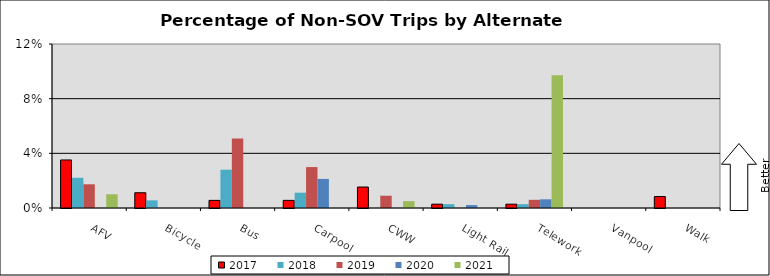
| Category | 2017 | 2018 | 2019 | 2020 | 2021 |
|---|---|---|---|---|---|
| AFV | 0.035 | 0.022 | 0.017 | 0 | 0.01 |
| Bicycle | 0.011 | 0.006 | 0 | 0 | 0 |
| Bus | 0.006 | 0.028 | 0.051 | 0 | 0 |
| Carpool | 0.006 | 0.011 | 0.03 | 0.021 | 0 |
| CWW | 0.015 | 0 | 0.009 | 0 | 0.005 |
| Light Rail | 0.003 | 0.003 | 0 | 0.002 | 0 |
| Telework | 0.003 | 0.003 | 0.006 | 0.006 | 0.097 |
| Vanpool | 0 | 0 | 0 | 0 | 0 |
| Walk | 0.008 | 0 | 0 | 0 | 0 |